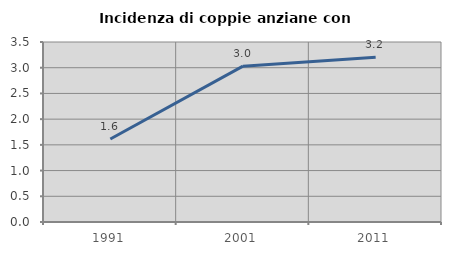
| Category | Incidenza di coppie anziane con figli |
|---|---|
| 1991.0 | 1.613 |
| 2001.0 | 3.03 |
| 2011.0 | 3.203 |